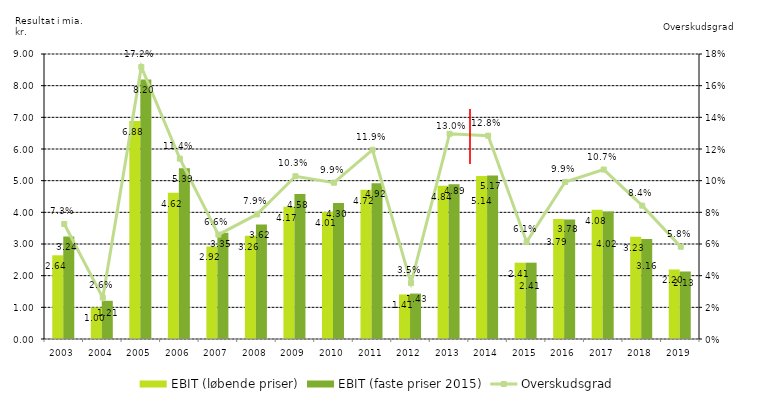
| Category | EBIT (løbende priser) | EBIT (faste priser 2015) |
|---|---|---|
| 2003.0 | 2.643 | 3.239 |
| 2004.0 | 0.995 | 1.206 |
| 2005.0 | 6.885 | 8.196 |
| 2006.0 | 4.616 | 5.393 |
| 2007.0 | 2.922 | 3.355 |
| 2008.0 | 3.26 | 3.618 |
| 2009.0 | 4.174 | 4.576 |
| 2010.0 | 4.007 | 4.295 |
| 2011.0 | 4.716 | 4.917 |
| 2012.0 | 1.408 | 1.434 |
| 2013.0 | 4.838 | 4.886 |
| 2014.0 | 5.145 | 5.165 |
| 2015.0 | 2.41 | 2.41 |
| 2016.0 | 3.787 | 3.776 |
| 2017.0 | 4.078 | 4.023 |
| 2018.0 | 3.225 | 3.156 |
| 2019.0 | 2.196 | 2.131 |